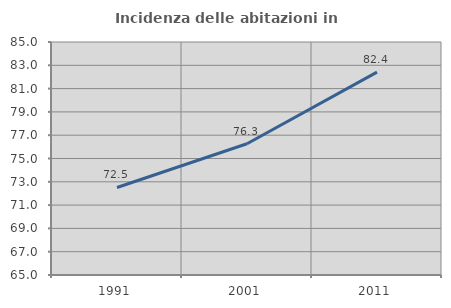
| Category | Incidenza delle abitazioni in proprietà  |
|---|---|
| 1991.0 | 72.512 |
| 2001.0 | 76.263 |
| 2011.0 | 82.412 |